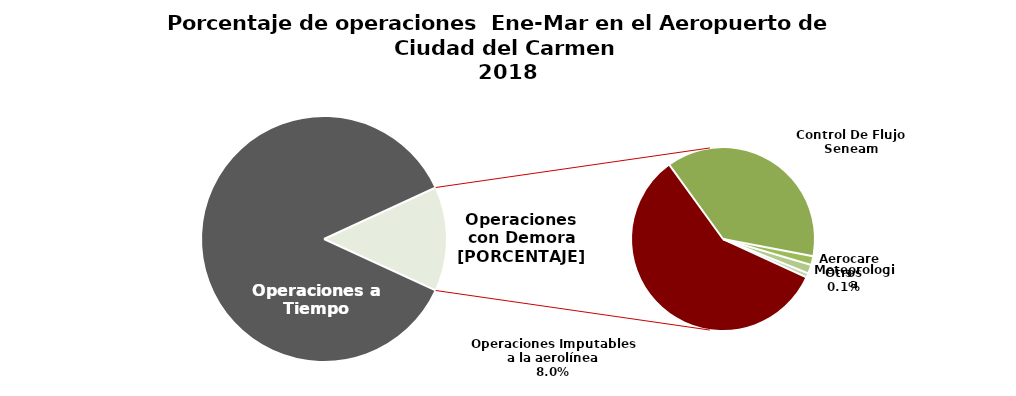
| Category | Series 0 |
|---|---|
| Operaciones a Tiempo | 809 |
| Operaciones Imputables a la aerolínea | 75 |
| Control De Flujo Seneam | 49 |
| Aerocares | 2 |
| Meteorologia | 2 |
| Otros | 1 |